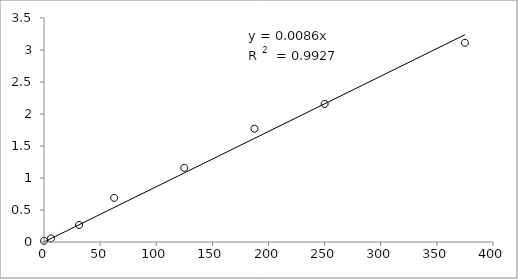
| Category | Series 0 |
|---|---|
| 375.0 | 3.113 |
| 250.0 | 2.157 |
| 187.5 | 1.771 |
| 125.0 | 1.16 |
| 62.5 | 0.69 |
| 31.25 | 0.266 |
| 6.25 | 0.056 |
| 0.0 | 0.018 |